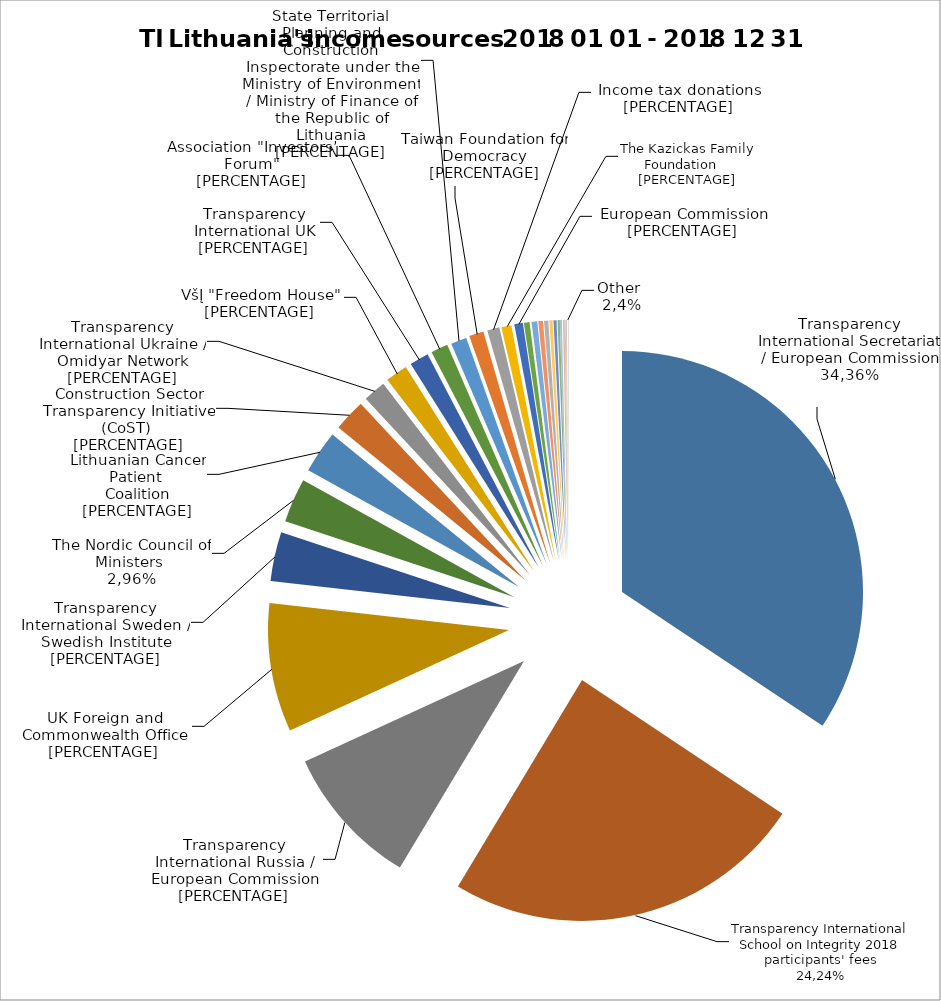
| Category | Series 0 | Series 1 |
|---|---|---|
| „Transparency International“ Sekretoriatas / Europos Komisija  | 90245 | 0.344 |
| „Transparency International“ Tarptautinės skaidrumo mokyklos 2018 dalyvių mokesčiai | 63670.17 | 0.242 |
| „Transparency International“ Rusijos skyrius / Europos Komisija  | 25066 | 0.095 |
| Jungtinės Karalystės Užsienio ir Sandraugos reikalų ministerija (UK Foreign and Commonwealth Office) | 22652.06 | 0.086 |
| „Transparency International“ Švedijos skyrius / Švedijos institutas | 8701.71 | 0.033 |
| Šiaurės ministrų taryba  | 7782.89 | 0.03 |
| Pagalbos onkologiniams ligoniams asociacija | 7500 | 0.029 |
| Construction Sector Transparency Initiative (CoST) / Jungtinės Karalystės tarptautinio vystymo departamentas ir Nyderlandų Karalystės užsienio reikalų ministerija | 5653.16 | 0.022 |
| „Transparency International“ Ukrainos skyrius / Omidyar Network | 3984 | 0.015 |
| VšĮ „Freedom House“ | 3900 | 0.015 |
| „Transparency International“ Jungtinės Karalystės skyrius | 3378.58 | 0.013 |
| Asociacija „Investors‘ Forum“ | 3000 | 0.011 |
| Valstybinė teritorijų planavimo ir statybos inspekcija prie Aplinkos ministerijos / Lietuvos Respublikos Finansų ministerija | 2800 | 0.011 |
| Taivano demokratijos stiprinimui skirtas fondas | 2561.81 | 0.01 |
| TILS skirtas gyventojų pajamų mokestis  | 2152.14 | 0.008 |
| Kazickų šeimos fondas | 1762.89 | 0.007 |
| Europos Komisija  | 1500 | 0.006 |
| Advokatų kontora SORAINEN ir partneriai | 1000 | 0.004 |
| Švedijos institutas | 1000 | 0.004 |
| Small Media Foundation | 825.92 | 0.003 |
| Prancūzijos Respublikos ambasada  | 750 | 0.003 |
| „Transparency International“ Sekretoriatas / Siemens Integrity Initiative | 550 | 0.002 |
| VšĮ „Pilietiškumo, demokratijos ir teisės programų centras“ | 533.91 | 0.002 |
| Vidaus auditorių asociacija | 400 | 0.002 |
| Kitos TILS uždirbtos lėšos | 358.66 | 0.001 |
| Lietuvos ryšių su visuomene specialistų sąjunga | 300 | 0.001 |
| UAB „Mokesčių srautas“ | 200 | 0.001 |
| Baltarusijos viešojo administravimo reformų ir transformacijos institutas | 100 | 0 |
| „Transparency International“ Slovakijos skyrius | 100 | 0 |
| K Adenauerio labdaros-paramos fondas bendradarbiavimui su Rytų Europa | 80 | 0 |
| Aukos | 57.07 | 0 |
| Šiaulių jaunimo organizacijų asociacija „Apskritasis stalas“ | 50 | 0 |